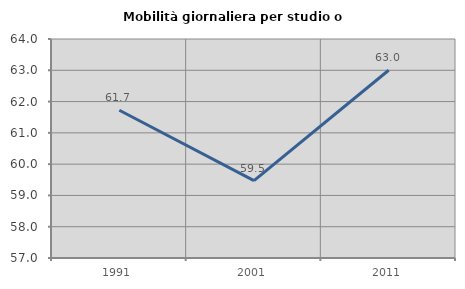
| Category | Mobilità giornaliera per studio o lavoro |
|---|---|
| 1991.0 | 61.722 |
| 2001.0 | 59.475 |
| 2011.0 | 63.002 |